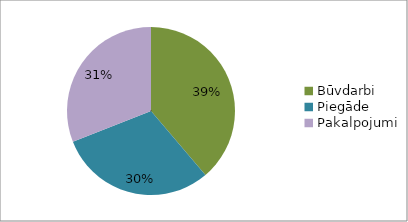
| Category | Series 0 |
|---|---|
| Būvdarbi | 0.388 |
| Piegāde | 0.302 |
| Pakalpojumi | 0.31 |